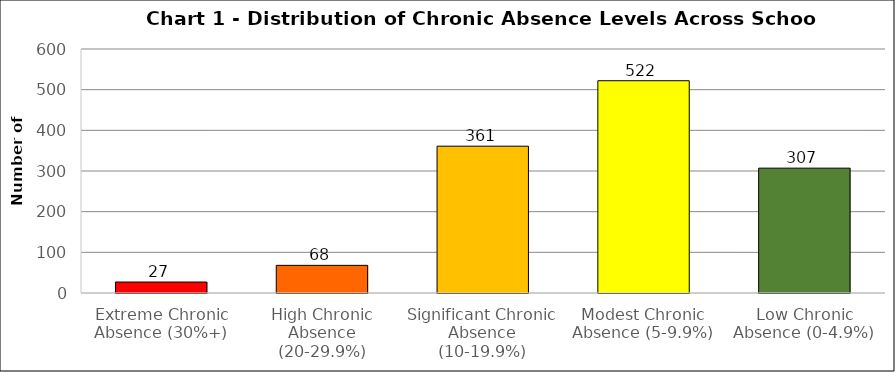
| Category | Series 0 |
|---|---|
| Extreme Chronic Absence (30%+) | 27 |
| High Chronic Absence (20-29.9%) | 68 |
| Significant Chronic Absence (10-19.9%) | 361 |
| Modest Chronic Absence (5-9.9%) | 522 |
| Low Chronic Absence (0-4.9%) | 307 |